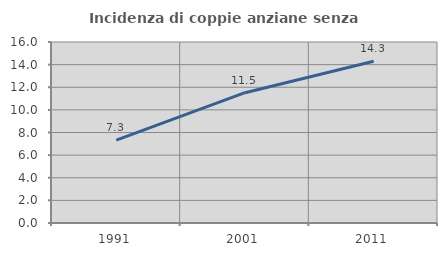
| Category | Incidenza di coppie anziane senza figli  |
|---|---|
| 1991.0 | 7.332 |
| 2001.0 | 11.517 |
| 2011.0 | 14.305 |